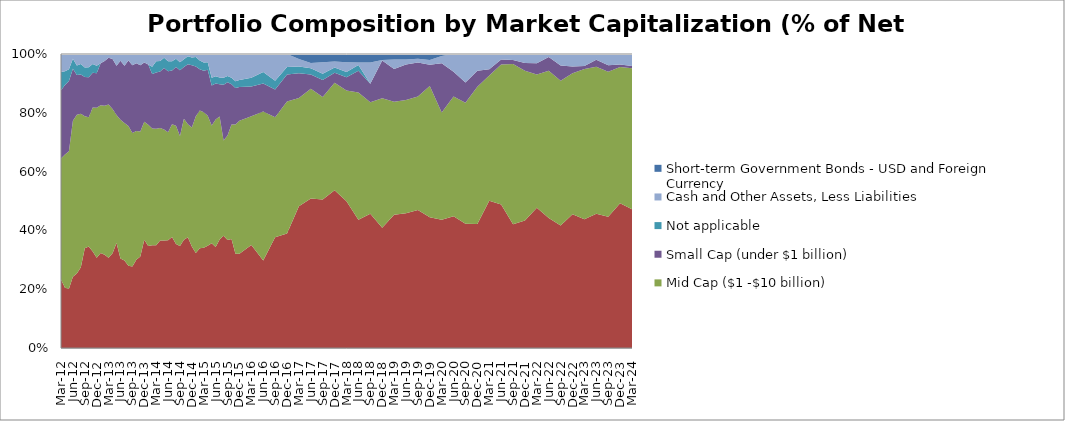
| Category | Large Cap (over $10 billion) | Mid Cap ($1 -$10 billion) | Small Cap (under $1 billion) | Not applicable | Cash and Other Assets, Less Liabilities | Short-term Government Bonds - USD and Foreign Currency |
|---|---|---|---|---|---|---|
| 2012-03-31 | 23.305 | 41.13 | 23.254 | 6.188 | 6.123 | 0 |
| 2012-04-30 | 20.45 | 45.32 | 23.66 | 4.71 | 5.84 | 0 |
| 2012-05-31 | 20.19 | 46.75 | 23.9 | 4.01 | 5.15 | 0 |
| 2012-06-30 | 24.26 | 53 | 17.7 | 3.39 | 1.65 | 0 |
| 2012-07-31 | 25.37 | 53.98 | 13.52 | 3.24 | 3.89 | 0 |
| 2012-08-31 | 27.45 | 52.23 | 13.37 | 3.56 | 3.39 | 0 |
| 2012-09-30 | 33.92 | 44.94 | 13.35 | 3.24 | 4.55 | 0 |
| 2012-10-31 | 34.53 | 43.92 | 13.64 | 3.4 | 4.51 | 0 |
| 2012-11-30 | 32.82 | 48.96 | 11.85 | 3.01 | 3.36 | 0 |
| 2012-12-31 | 30.66 | 51.07 | 11.72 | 2.59 | 3.96 | 0 |
| 2013-01-31 | 32.33 | 50.24 | 14.25 | 0 | 3.18 | 0 |
| 2013-02-28 | 31.69 | 50.74 | 15.15 | 0 | 2.42 | 0 |
| 2013-03-31 | 30.7 | 52.1 | 15.93 | 0 | 1.27 | 0 |
| 2013-04-30 | 32.24 | 49.06 | 17.03 | 0 | 1.67 | 0 |
| 2013-05-31 | 35.68 | 43.58 | 16.73 | 0 | 4.01 | 0 |
| 2013-06-30 | 30.42 | 47.2 | 20.07 | 0 | 2.31 | 0 |
| 2013-07-31 | 29.74 | 46.76 | 19.48 | 0 | 4.02 | 0 |
| 2013-08-31 | 27.95 | 47.57 | 22.24 | 0 | 2.24 | 0 |
| 2013-09-30 | 27.72 | 45.41 | 23.07 | 0 | 3.8 | 0 |
| 2013-10-31 | 30.05 | 43.71 | 23.11 | 0 | 3.12 | 0 |
| 2013-11-30 | 31.1 | 42.56 | 22.48 | 0 | 3.86 | 0 |
| 2013-12-31 | 36.86 | 40.07 | 20.21 | 0 | 2.86 | 0 |
| 2014-01-31 | 34.71 | 41.2 | 20.56 | 0 | 3.53 | 0 |
| 2014-02-28 | 34.9 | 39.75 | 18.54 | 2.45 | 4.33 | 0 |
| 2014-03-31 | 34.991 | 39.554 | 19.203 | 3.749 | 2.503 | 0 |
| 2014-04-30 | 36.55 | 38.25 | 19.22 | 3.63 | 2.35 | 0 |
| 2014-05-31 | 36.54 | 37.76 | 20.93 | 3.52 | 1.25 | 0 |
| 2014-06-30 | 36.63 | 36.72 | 20.8 | 3.39 | 2.46 | 0 |
| 2014-07-31 | 37.72 | 38.36 | 18.31 | 3.17 | 2.44 | 0 |
| 2014-08-31 | 35.33 | 40.24 | 19.97 | 2.84 | 1.614 | 0 |
| 2014-09-30 | 34.73 | 37.42 | 22.36 | 2.7 | 2.79 | 0 |
| 2014-10-31 | 36.85 | 41.11 | 17.59 | 2.63 | 1.82 | 0 |
| 2014-11-30 | 37.65 | 38.44 | 20.46 | 2.69 | 0.76 | 0 |
| 2014-12-31 | 34.55 | 40.43 | 21.21 | 2.61 | 1.2 | 0 |
| 2015-01-31 | 32.32 | 46.49 | 16.9 | 3.31 | 0.98 | 0 |
| 2015-02-28 | 33.91 | 46.86 | 14.07 | 2.91 | 2.25 | 0 |
| 2015-03-31 | 34.09 | 46.06 | 14.18 | 2.82 | 2.85 | 0 |
| 2015-04-30 | 34.78 | 44.18 | 15.7 | 2.5 | 2.84 | 0 |
| 2015-05-31 | 35.64 | 40.04 | 13.57 | 2.7 | 8.05 | 0 |
| 2015-06-30 | 34.38 | 43.3 | 12.25 | 2.53 | 7.54 | 0 |
| 2015-07-31 | 36.9 | 41.82 | 10.98 | 2.32 | 7.98 | 0 |
| 2015-08-31 | 38.22 | 32.33 | 19.03 | 2.3 | 8.12 | 0 |
| 2015-09-30 | 36.76 | 35.51 | 18.08 | 2.15 | 7.5 | 0 |
| 2015-10-31 | 37.11 | 38.94 | 13.7 | 2.17 | 8.08 | 0 |
| 2015-11-30 | 32.03 | 43.97 | 12.44 | 2.32 | 9.24 | 0 |
| 2015-12-31 | 32.06 | 45.23 | 11.52 | 2.38 | 8.81 | 0 |
| 2016-03-31 | 35.01 | 43.83 | 10.09 | 3.03 | 8.04 | 0 |
| 2016-06-30 | 29.78 | 50.68 | 9.54 | 3.91 | 6.09 | 0 |
| 2016-09-30 | 37.69 | 40.81 | 9.45 | 2.94 | 9.11 | 0 |
| 2016-12-31 | 38.94 | 44.87 | 9.19 | 2.57 | 4.43 | 0 |
| 2017-03-31 | 48.23 | 36.79 | 8.39 | 2.34 | 2.59 | 1.66 |
| 2017-06-30 | 50.86 | 37.36 | 4.77 | 2.2 | 1.72 | 3.09 |
| 2017-09-30 | 50.54 | 34.84 | 5.75 | 2.13 | 3.93 | 2.81 |
| 2017-12-31 | 53.62 | 36.56 | 3.4 | 1.87 | 2.01 | 2.54 |
| 2018-03-31 | 49.88 | 37.68 | 4.49 | 1.87 | 3.26 | 2.82 |
| 2018-06-30 | 43.63 | 43.25 | 7.45 | 1.91 | 0.83 | 2.93 |
| 2018-09-30 | 45.65 | 37.98 | 6.22 | 0 | 7.29 | 2.86 |
| 2018-12-31 | 40.91 | 44.06 | 12.84 | 0 | 0.12 | 2.07 |
| 2019-03-31 | 45.31 | 38.41 | 11.16 | 0 | 3.24 | 1.88 |
| 2019-06-30 | 45.87 | 38.47 | 12.11 | 0 | 1.71 | 1.84 |
| 2019-09-30 | 46.96 | 38.55 | 11.61 | 0 | 1.24 | 1.64 |
| 2019-12-31 | 44.5 | 44.63 | 7.18 | 0 | 1.62 | 2.07 |
| 2020-03-31 | 43.63 | 36.45 | 16.76 | 0 | 2.52 | 0.64 |
| 2020-06-30 | 44.84 | 40.7 | 8.39 | 0 | 6.07 | 0 |
| 2020-09-30 | 42.27 | 41.11 | 6.89 | 0 | 9.73 | 0 |
| 2020-12-31 | 42.19 | 46.63 | 5.48 | 0 | 5.7 | 0 |
| 2021-03-31 | 50.11 | 42.61 | 2.07 | 0 | 5.21 | 0 |
| 2021-06-30 | 48.85 | 47.54 | 1.75 | 0 | 1.86 | 0 |
| 2021-09-30 | 42.07 | 54.51 | 1.37 | 0 | 2.05 | 0 |
| 2021-12-31 | 43.39 | 50.92 | 2.63 | 0 | 3.06 | 0 |
| 2022-03-31 | 47.68 | 45.37 | 3.84 | 0 | 3.11 | 0 |
| 2022-06-30 | 44.25 | 50.08 | 4.63 | 0 | 1.04 | 0 |
| 2022-09-30 | 41.63 | 49.28 | 5.22 | 0 | 3.87 | 0 |
| 2022-12-31 | 45.47 | 47.94 | 2.38 | 0 | 4.21 | 0 |
| 2023-03-31 | 43.78 | 51.15 | 0.99 | 0 | 4.08 | 0 |
| 2023-06-30 | 45.69 | 49.97 | 2.4 | 0 | 1.94 | 0 |
| 2023-09-30 | 44.67 | 49.3 | 2.22 | 0 | 3.81 | 0 |
| 2023-12-31 | 49.26 | 46.32 | 0.84 | 0 | 3.58 | 0 |
| 2024-03-31 | 47.17 | 48 | 0.78 | 0 | 4.05 | 0 |